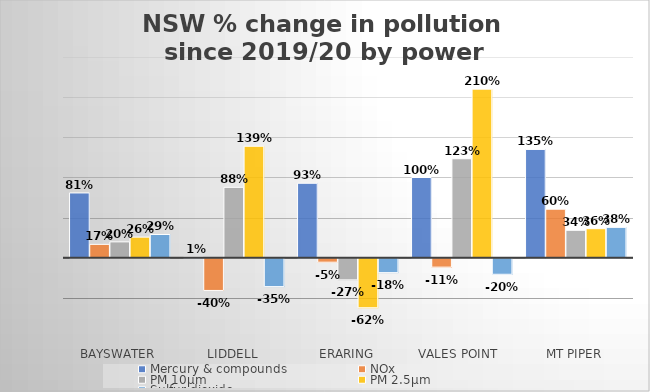
| Category | Mercury & compounds | NOx | PM 10μm | PM 2.5μm | Sulfur dioxide |
|---|---|---|---|---|---|
| Bayswater | 0.807 | 0.166 | 0.197 | 0.256 | 0.289 |
| Liddell | 0.009 | -0.401 | 0.877 | 1.388 | -0.354 |
|  Eraring  | 0.927 | -0.05 | -0.27 | -0.617 | -0.179 |
| Vales Point  | 0.999 | -0.111 | 1.233 | 2.1 | -0.2 |
| Mt Piper | 1.349 | 0.604 | 0.342 | 0.361 | 0.378 |